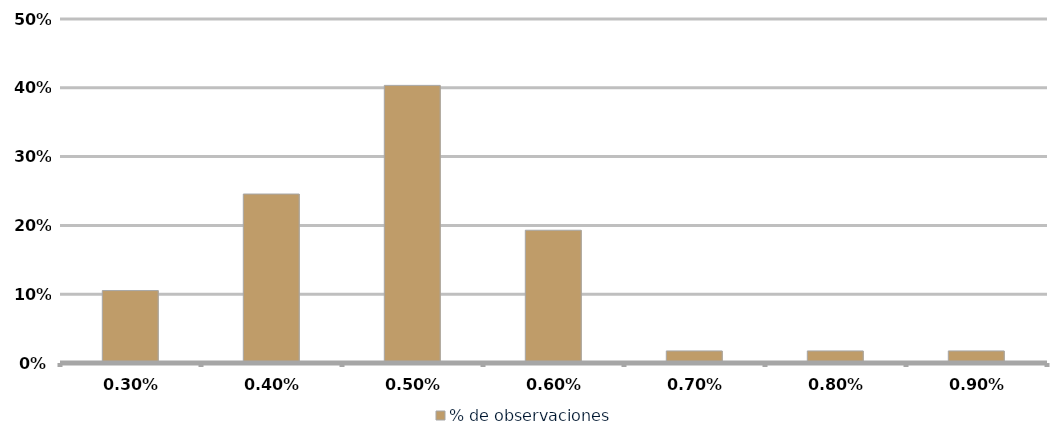
| Category | % de observaciones  |
|---|---|
| 0.003 | 0.105 |
| 0.004 | 0.246 |
| 0.005 | 0.404 |
| 0.006 | 0.193 |
| 0.007 | 0.018 |
| 0.008 | 0.018 |
| 0.009000000000000001 | 0.018 |